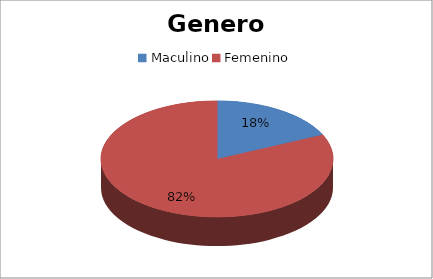
| Category | Cant. |
|---|---|
| Maculino | 2 |
| Femenino | 9 |